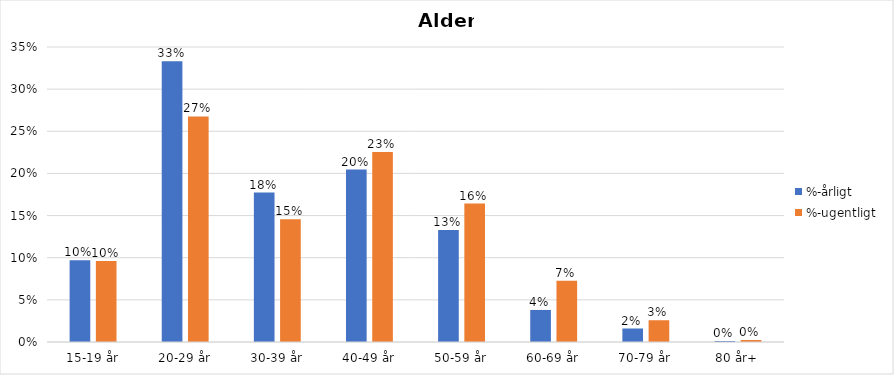
| Category | %-årligt | %-ugentligt |
|---|---|---|
| 15-19 år | 0.097 | 0.096 |
| 20-29 år | 0.333 | 0.268 |
| 30-39 år | 0.177 | 0.146 |
| 40-49 år | 0.205 | 0.225 |
| 50-59 år | 0.133 | 0.164 |
| 60-69 år | 0.038 | 0.073 |
| 70-79 år | 0.016 | 0.026 |
| 80 år+ | 0.001 | 0.002 |